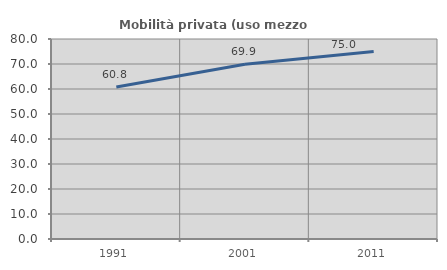
| Category | Mobilità privata (uso mezzo privato) |
|---|---|
| 1991.0 | 60.826 |
| 2001.0 | 69.892 |
| 2011.0 | 74.965 |